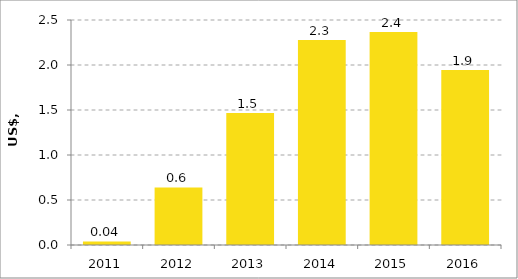
| Category | Series 0 |
|---|---|
| 2011.0 | 0.039 |
| 2012.0 | 0.64 |
| 2013.0 | 1.466 |
| 2014.0 | 2.277 |
| 2015.0 | 2.367 |
| 2016.0 | 1.943 |